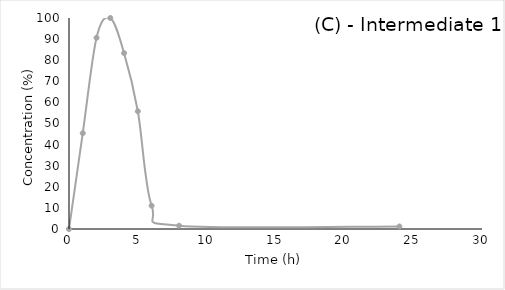
| Category | Series 2 |
|---|---|
| 0.0 | 0 |
| 1.0 | 45.394 |
| 2.0 | 90.626 |
| 3.0 | 100 |
| 4.0 | 83.357 |
| 5.0 | 55.803 |
| 6.0 | 11.053 |
| 8.0 | 1.563 |
| 24.0 | 1.203 |